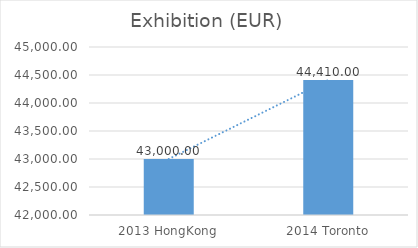
| Category | Exhibition |
|---|---|
| 2013 HongKong | 43000 |
| 2014 Toronto | 44410 |